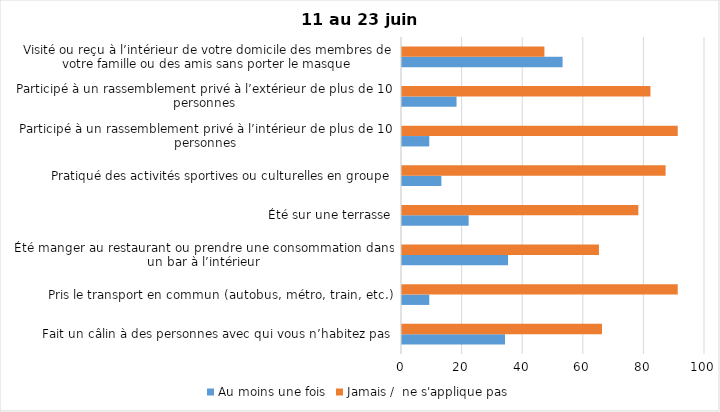
| Category | Au moins une fois | Jamais /  ne s'applique pas |
|---|---|---|
| Fait un câlin à des personnes avec qui vous n’habitez pas | 34 | 66 |
| Pris le transport en commun (autobus, métro, train, etc.) | 9 | 91 |
| Été manger au restaurant ou prendre une consommation dans un bar à l’intérieur | 35 | 65 |
| Été sur une terrasse | 22 | 78 |
| Pratiqué des activités sportives ou culturelles en groupe | 13 | 87 |
| Participé à un rassemblement privé à l’intérieur de plus de 10 personnes | 9 | 91 |
| Participé à un rassemblement privé à l’extérieur de plus de 10 personnes | 18 | 82 |
| Visité ou reçu à l’intérieur de votre domicile des membres de votre famille ou des amis sans porter le masque | 53 | 47 |